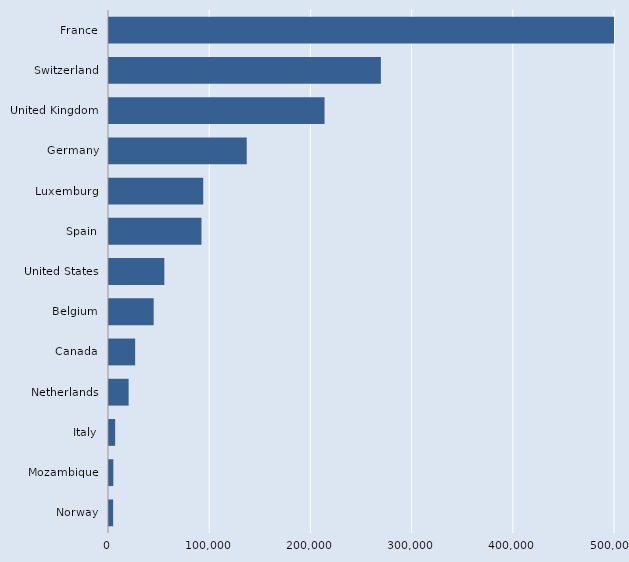
| Category | Series 0 |
|---|---|
| Norway | 4094 |
| Mozambique | 4279 |
| Italy | 6088 |
| Netherlands | 19384 |
| Canada | 25855 |
| Belgium | 44166 |
| United States | 54669 |
| Spain | 91371 |
| Luxemburg | 93100 |
| Germany | 136080 |
| United Kingdom | 213000 |
| Switzerland | 268660 |
| France | 530557 |